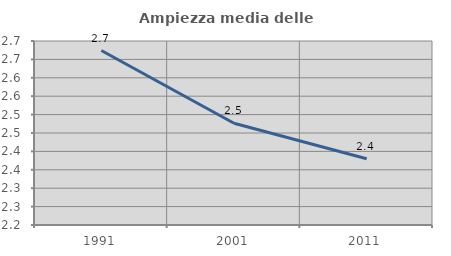
| Category | Ampiezza media delle famiglie |
|---|---|
| 1991.0 | 2.674 |
| 2001.0 | 2.477 |
| 2011.0 | 2.38 |